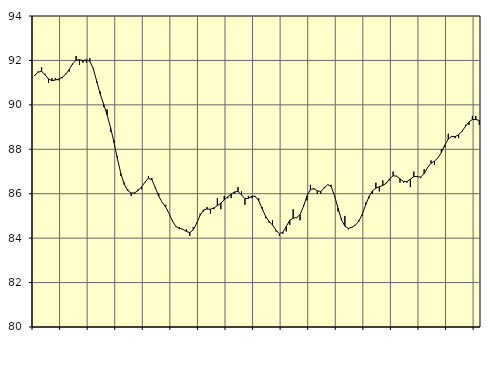
| Category | Piggar | Series 1 |
|---|---|---|
| nan | 91.3 | 91.33 |
| 87.0 | 91.5 | 91.47 |
| 87.0 | 91.7 | 91.51 |
| 87.0 | 91.4 | 91.36 |
| nan | 91 | 91.16 |
| 88.0 | 91.2 | 91.09 |
| 88.0 | 91.2 | 91.12 |
| 88.0 | 91.1 | 91.16 |
| nan | 91.2 | 91.24 |
| 89.0 | 91.4 | 91.38 |
| 89.0 | 91.5 | 91.59 |
| 89.0 | 91.8 | 91.85 |
| nan | 92.2 | 92.01 |
| 90.0 | 91.8 | 92.03 |
| 90.0 | 91.9 | 91.99 |
| 90.0 | 91.9 | 92.03 |
| nan | 92.1 | 91.96 |
| 91.0 | 91.6 | 91.62 |
| 91.0 | 91 | 91.06 |
| 91.0 | 90.6 | 90.49 |
| nan | 89.9 | 90.03 |
| 92.0 | 89.8 | 89.55 |
| 92.0 | 88.8 | 88.98 |
| 92.0 | 88.4 | 88.31 |
| nan | 87.7 | 87.57 |
| 93.0 | 86.8 | 86.91 |
| 93.0 | 86.5 | 86.41 |
| 93.0 | 86.2 | 86.14 |
| nan | 85.9 | 86.03 |
| 94.0 | 86 | 86.04 |
| 94.0 | 86.2 | 86.14 |
| 94.0 | 86.2 | 86.31 |
| nan | 86.5 | 86.52 |
| 95.0 | 86.8 | 86.7 |
| 95.0 | 86.7 | 86.63 |
| 95.0 | 86.3 | 86.27 |
| nan | 86 | 85.88 |
| 96.0 | 85.6 | 85.61 |
| 96.0 | 85.5 | 85.4 |
| 96.0 | 85.1 | 85.1 |
| nan | 84.8 | 84.76 |
| 97.0 | 84.5 | 84.52 |
| 97.0 | 84.5 | 84.44 |
| 97.0 | 84.4 | 84.4 |
| nan | 84.4 | 84.3 |
| 98.0 | 84.1 | 84.25 |
| 98.0 | 84.5 | 84.37 |
| 98.0 | 84.7 | 84.67 |
| nan | 85.1 | 85.03 |
| 99.0 | 85.2 | 85.27 |
| 99.0 | 85.4 | 85.31 |
| 99.0 | 85.1 | 85.3 |
| nan | 85.3 | 85.36 |
| 0.0 | 85.8 | 85.46 |
| 0.0 | 85.3 | 85.58 |
| 0.0 | 85.9 | 85.72 |
| nan | 85.8 | 85.86 |
| 1.0 | 85.8 | 85.98 |
| 1.0 | 86 | 86.08 |
| 1.0 | 86.3 | 86.1 |
| nan | 86.1 | 85.95 |
| 2.0 | 85.5 | 85.78 |
| 2.0 | 85.9 | 85.79 |
| 2.0 | 85.8 | 85.89 |
| nan | 85.9 | 85.88 |
| 3.0 | 85.8 | 85.68 |
| 3.0 | 85.4 | 85.33 |
| 3.0 | 84.9 | 84.98 |
| nan | 84.7 | 84.76 |
| 4.0 | 84.8 | 84.59 |
| 4.0 | 84.3 | 84.36 |
| 4.0 | 84.1 | 84.2 |
| nan | 84.2 | 84.27 |
| 5.0 | 84.3 | 84.53 |
| 5.0 | 84.6 | 84.8 |
| 5.0 | 85.3 | 84.9 |
| nan | 84.9 | 84.93 |
| 6.0 | 84.8 | 85.06 |
| 6.0 | 85.5 | 85.43 |
| 6.0 | 85.7 | 85.9 |
| nan | 86.4 | 86.19 |
| 7.0 | 86.2 | 86.23 |
| 7.0 | 86 | 86.13 |
| 7.0 | 86 | 86.1 |
| nan | 86.3 | 86.25 |
| 8.0 | 86.4 | 86.41 |
| 8.0 | 86.4 | 86.33 |
| 8.0 | 85.9 | 85.91 |
| nan | 85.2 | 85.35 |
| 9.0 | 84.9 | 84.83 |
| 9.0 | 85 | 84.54 |
| 9.0 | 84.4 | 84.44 |
| nan | 84.5 | 84.48 |
| 10.0 | 84.6 | 84.58 |
| 10.0 | 84.8 | 84.75 |
| 10.0 | 85 | 85.06 |
| nan | 85.6 | 85.48 |
| 11.0 | 85.8 | 85.87 |
| 11.0 | 86 | 86.13 |
| 11.0 | 86.5 | 86.25 |
| nan | 86.1 | 86.32 |
| 12.0 | 86.6 | 86.37 |
| 12.0 | 86.5 | 86.47 |
| 12.0 | 86.6 | 86.67 |
| nan | 87 | 86.81 |
| 13.0 | 86.8 | 86.79 |
| 13.0 | 86.5 | 86.67 |
| 13.0 | 86.5 | 86.55 |
| nan | 86.5 | 86.54 |
| 14.0 | 86.3 | 86.66 |
| 14.0 | 87 | 86.77 |
| 14.0 | 86.8 | 86.77 |
| nan | 86.7 | 86.75 |
| 15.0 | 87.1 | 86.9 |
| 15.0 | 87.2 | 87.18 |
| 15.0 | 87.5 | 87.37 |
| nan | 87.3 | 87.47 |
| 16.0 | 87.6 | 87.61 |
| 16.0 | 88 | 87.86 |
| 16.0 | 88.1 | 88.19 |
| nan | 88.7 | 88.46 |
| 17.0 | 88.6 | 88.58 |
| 17.0 | 88.5 | 88.57 |
| 17.0 | 88.5 | 88.65 |
| nan | 88.8 | 88.82 |
| 18.0 | 89.1 | 89.03 |
| 18.0 | 89.1 | 89.23 |
| 18.0 | 89.5 | 89.34 |
| nan | 89.5 | 89.34 |
| 19.0 | 89.1 | 89.3 |